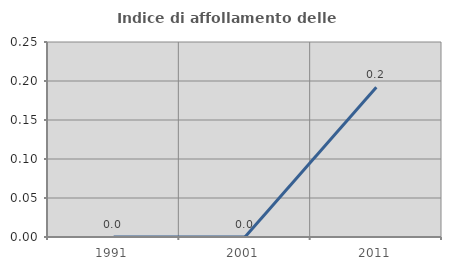
| Category | Indice di affollamento delle abitazioni  |
|---|---|
| 1991.0 | 0 |
| 2001.0 | 0 |
| 2011.0 | 0.192 |